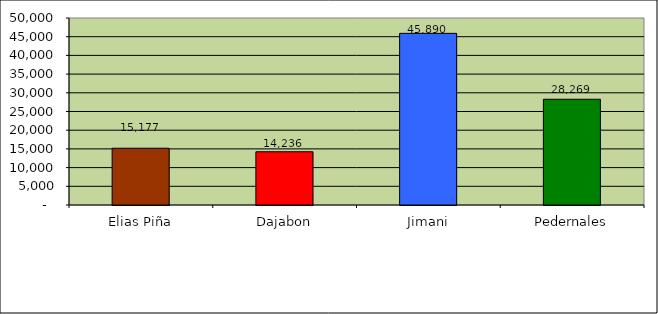
| Category | Series 0 |
|---|---|
| Elias Piña | 15177 |
| Dajabon | 14236 |
| Jimani | 45890 |
| Pedernales | 28269 |